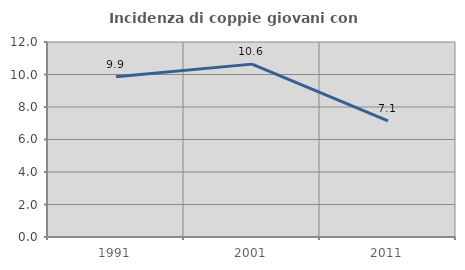
| Category | Incidenza di coppie giovani con figli |
|---|---|
| 1991.0 | 9.865 |
| 2001.0 | 10.638 |
| 2011.0 | 7.143 |